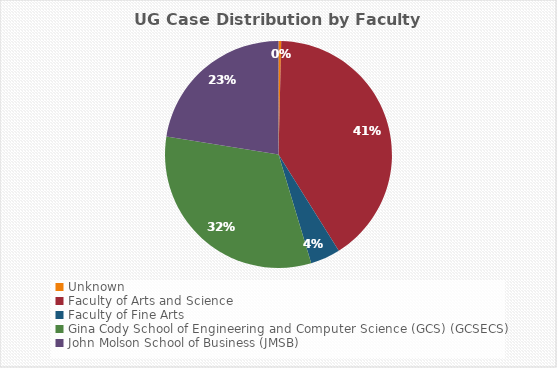
| Category | Series 0 |
|---|---|
| Unknown | 1 |
| Faculty of Arts and Science | 105 |
| Faculty of Fine Arts | 11 |
| Gina Cody School of Engineering and Computer Science (GCS) (GCSECS) | 83 |
| John Molson School of Business (JMSB) | 58 |